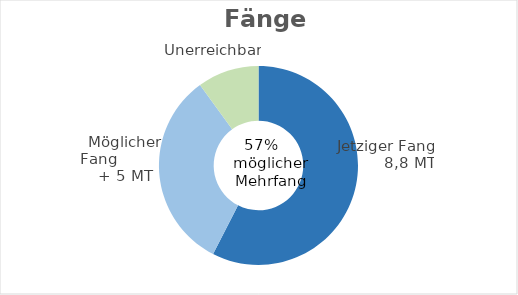
| Category | Series 0 |
|---|---|
| 0 | 8846147.717 |
| 1 | 4989509.276 |
| 2 | 1537295.221 |